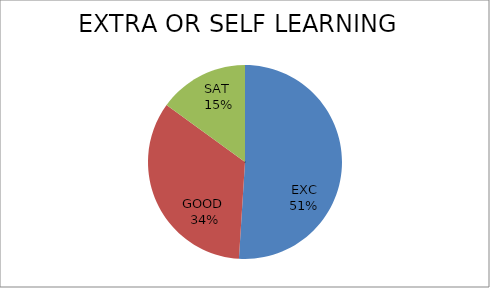
| Category | Series 0 |
|---|---|
| EXC | 51 |
| GOOD  | 34 |
| SAT  | 15 |